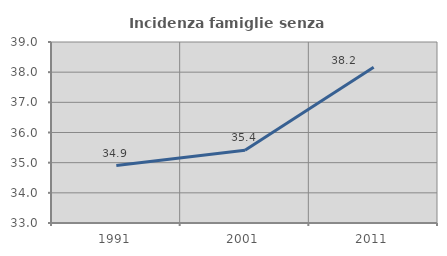
| Category | Incidenza famiglie senza nuclei |
|---|---|
| 1991.0 | 34.903 |
| 2001.0 | 35.409 |
| 2011.0 | 38.165 |